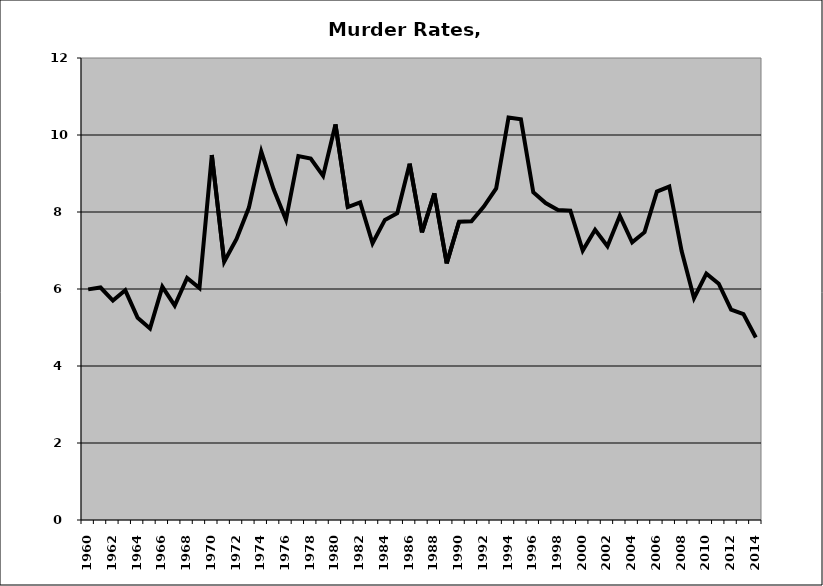
| Category | Murder |
|---|---|
| 1960.0 | 5.99 |
| 1961.0 | 6.039 |
| 1962.0 | 5.699 |
| 1963.0 | 5.965 |
| 1964.0 | 5.25 |
| 1965.0 | 4.975 |
| 1966.0 | 6.057 |
| 1967.0 | 5.569 |
| 1968.0 | 6.287 |
| 1969.0 | 6.025 |
| 1970.0 | 9.478 |
| 1971.0 | 6.706 |
| 1972.0 | 7.301 |
| 1973.0 | 8.115 |
| 1974.0 | 9.568 |
| 1975.0 | 8.588 |
| 1976.0 | 7.797 |
| 1977.0 | 9.451 |
| 1978.0 | 9.388 |
| 1979.0 | 8.939 |
| 1980.0 | 10.275 |
| 1981.0 | 8.127 |
| 1982.0 | 8.252 |
| 1983.0 | 7.189 |
| 1984.0 | 7.796 |
| 1985.0 | 7.97 |
| 1986.0 | 9.255 |
| 1987.0 | 7.472 |
| 1988.0 | 8.482 |
| 1989.0 | 6.665 |
| 1990.0 | 7.748 |
| 1991.0 | 7.76 |
| 1992.0 | 8.142 |
| 1993.0 | 8.613 |
| 1994.0 | 10.454 |
| 1995.0 | 10.408 |
| 1996.0 | 8.514 |
| 1997.0 | 8.233 |
| 1998.0 | 8.053 |
| 1999.0 | 8.036 |
| 2000.0 | 6.997 |
| 2001.0 | 7.537 |
| 2002.0 | 7.112 |
| 2003.0 | 7.904 |
| 2004.0 | 7.213 |
| 2005.0 | 7.475 |
| 2006.0 | 8.53 |
| 2007.0 | 8.661 |
| 2008.0 | 6.985 |
| 2009.0 | 5.761 |
| 2010.0 | 6.399 |
| 2011.0 | 6.139 |
| 2012.0 | 5.465 |
| 2013.0 | 5.35 |
| 2014.0 | 4.739 |